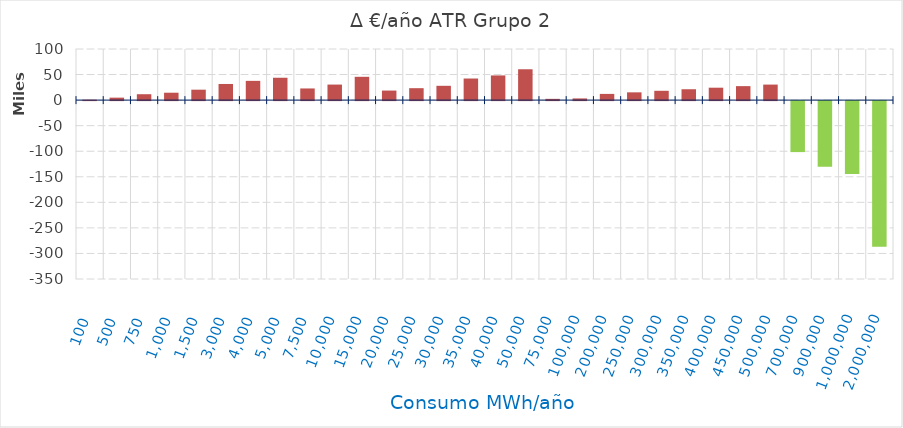
| Category | D €/año |
|---|---|
| 100.0 | 964.311 |
| 500.0 | 4816.361 |
| 750.0 | 11534.64 |
| 1000.0 | 14491.804 |
| 1500.0 | 20406.132 |
| 3000.0 | 31587.193 |
| 4000.0 | 37672.849 |
| 5000.0 | 43758.505 |
| 7500.0 | 22797.567 |
| 10000.0 | 30396.756 |
| 15000.0 | 45595.134 |
| 20000.0 | 18670.966 |
| 25000.0 | 23338.708 |
| 30000.0 | 28006.449 |
| 35000.0 | 42245.633 |
| 40000.0 | 48280.724 |
| 50000.0 | 60350.905 |
| 75000.0 | 2482.884 |
| 100000.0 | 3310.512 |
| 200000.0 | 12150.275 |
| 250000.0 | 15187.843 |
| 300000.0 | 18225.412 |
| 350000.0 | 21262.981 |
| 400000.0 | 24300.55 |
| 450000.0 | 27338.118 |
| 500000.0 | 30375.687 |
| 700000.0 | -99760.178 |
| 900000.0 | -128263.087 |
| 1000000.0 | -142514.541 |
| 2000000.0 | -285029.081 |